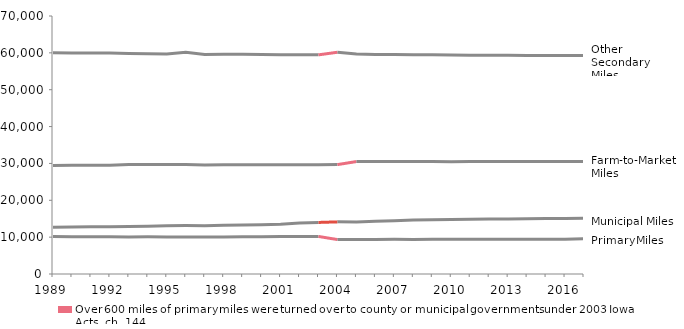
| Category | PrimaryMiles | FarmToMarketMiles | SecondaryMiles | MunicipalMiles |
|---|---|---|---|---|
| 1989.0 | 10158 | 29470 | 60059 | 12688 |
| 1990.0 | 10132 | 29500 | 59993 | 12776 |
| 1991.0 | 10096 | 29501 | 59967 | 12818 |
| 1992.0 | 10106 | 29514 | 59938 | 12837 |
| 1993.0 | 10065 | 29677 | 59812 | 12896 |
| 1994.0 | 10078 | 29686 | 59768 | 12967 |
| 1995.0 | 10067 | 29687 | 59709 | 13075 |
| 1996.0 | 10068 | 29685 | 60195 | 13135 |
| 1997.0 | 10037 | 29588 | 59532 | 13120 |
| 1998.0 | 10066 | 29671 | 59646 | 13251 |
| 1999.0 | 10085 | 29657 | 59621 | 13271 |
| 2000.0 | 10130 | 29651 | 59558 | 13394 |
| 2001.0 | 10156 | 29649 | 59510 | 13484 |
| 2002.0 | 10167 | 29642 | 59495 | 13808 |
| 2003.0 | 10190 | 29637 | 59458 | 13987 |
| 2004.0 | 9342 | 29680 | 60165 | 14145 |
| 2005.0 | 9355 | 30511 | 59701 | 14097 |
| 2006.0 | 9373 | 30504 | 59571 | 14339 |
| 2007.0 | 9400 | 30508 | 59531 | 14469 |
| 2008.0 | 9393 | 30490 | 59514 | 14630 |
| 2009.0 | 9404 | 30499 | 59458 | 14702 |
| 2010.0 | 9403 | 30485 | 59425 | 14804 |
| 2011.0 | 9401 | 30509 | 59357 | 14887 |
| 2012.0 | 9415 | 30501 | 59341 | 14904 |
| 2013.0 | 9420 | 30515 | 59320 | 14953 |
| 2014.0 | 9410 | 30518 | 59306 | 14965 |
| 2015.0 | 9403 | 30539 | 59278 | 15037 |
| 2016.0 | 9402 | 30530 | 59253 | 15067 |
| 2017.0 | 9574 | 30556 | 59277 | 15102 |